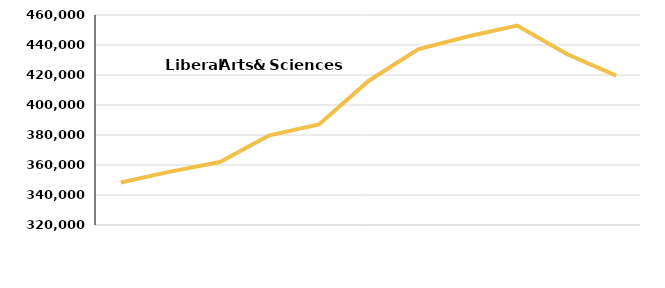
| Category | Liberal Arts and Sciences |
|---|---|
| FY2009 | 348309 |
| FY2010 | 355568 |
| FY2011 | 361966 |
| FY2012 | 379796 |
| FY2013 | 387040 |
| FY2014 | 416019 |
| FY2015 | 437142.53 |
| FY2016 | 445653.69 |
| FY2017 | 452950.694 |
| FY2018 | 433996.53 |
| FY2019 | 419555.123 |